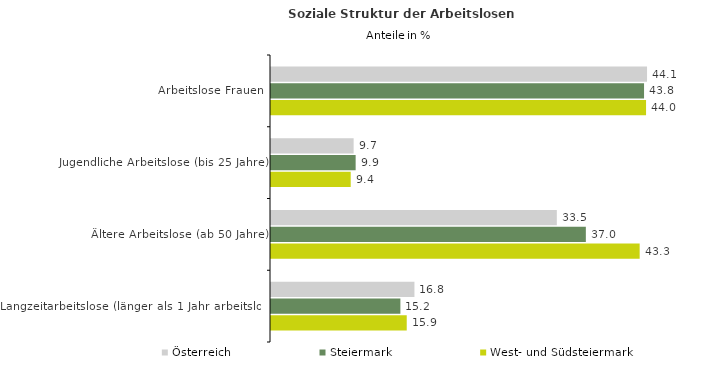
| Category | Österreich | Steiermark | West- und Südsteiermark |
|---|---|---|---|
| Arbeitslose Frauen | 44.136 | 43.785 | 44.02 |
| Jugendliche Arbeitslose (bis 25 Jahre) | 9.698 | 9.935 | 9.356 |
| Ältere Arbeitslose (ab 50 Jahre) | 33.548 | 36.954 | 43.27 |
| Langzeitarbeitslose (länger als 1 Jahr arbeitslos) | 16.836 | 15.186 | 15.931 |